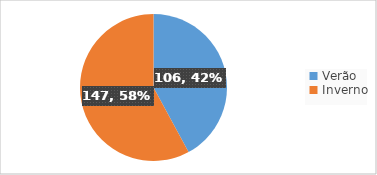
| Category | Series 0 |
|---|---|
| Verão | 106.478 |
| Inverno | 146.521 |